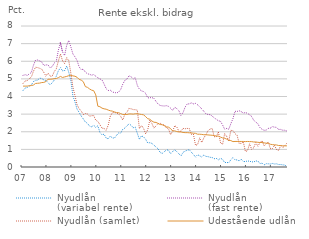
| Category | Nyudlån 
(variabel rente) | Nyudlån 
(fast rente) | Nyudlån (samlet) | Udestående udlån |
|---|---|---|---|---|
| 07 | 4.34 | 5.2 | 4.74 | 4.59 |
|  | 4.48 | 5.23 | 4.88 | 4.59 |
|  | 4.51 | 5.2 | 4.9 | 4.59 |
|  | 4.59 | 5.28 | 5.01 | 4.61 |
|  | 4.66 | 5.36 | 5.1 | 4.62 |
|  | 4.84 | 5.77 | 5.43 | 4.65 |
|  | 4.92 | 6.06 | 5.66 | 4.74 |
|  | 4.93 | 6.07 | 5.64 | 4.75 |
|  | 5.04 | 6.02 | 5.6 | 4.76 |
|  | 5.02 | 5.96 | 5.55 | 4.79 |
|  | 4.94 | 5.76 | 5.37 | 4.8 |
|  | 4.91 | 5.79 | 5.16 | 4.85 |
| 08 | 4.79 | 5.8 | 5.33 | 4.98 |
|  | 4.67 | 5.63 | 5.16 | 4.98 |
|  | 4.77 | 5.69 | 5.14 | 4.99 |
|  | 4.93 | 5.9 | 5.41 | 5.01 |
|  | 5.15 | 6 | 5.57 | 5.02 |
|  | 5.46 | 6.63 | 6.01 | 5.07 |
|  | 5.63 | 7.04 | 6.42 | 5.14 |
|  | 5.46 | 6.53 | 6.03 | 5.08 |
|  | 5.47 | 6.33 | 5.87 | 5.11 |
|  | 5.73 | 6.9 | 6.2 | 5.14 |
|  | 5.38 | 7.18 | 6.03 | 5.18 |
|  | 4.91 | 6.82 | 5.33 | 5.2 |
| 09 | 4.03 | 6.41 | 4.53 | 5.17 |
|  | 3.69 | 6.25 | 4.05 | 5.15 |
|  | 3.28 | 6.04 | 3.53 | 5.09 |
|  | 3.1 | 5.68 | 3.31 | 4.97 |
|  | 2.89 | 5.52 | 3.17 | 4.93 |
|  | 2.73 | 5.55 | 2.98 | 4.84 |
|  | 2.55 | 5.38 | 3.03 | 4.56 |
|  | 2.48 | 5.29 | 3.01 | 4.52 |
|  | 2.32 | 5.26 | 2.88 | 4.43 |
|  | 2.28 | 5.21 | 2.91 | 4.36 |
|  | 2.37 | 5.24 | 2.92 | 4.33 |
|  | 2.26 | 5.15 | 2.65 | 4.09 |
| 10 | 2.34 | 5.06 | 2.59 | 3.45 |
|  | 1.96 | 5 | 2.4 | 3.42 |
|  | 1.83 | 4.94 | 2.2 | 3.34 |
|  | 1.86 | 4.71 | 2.19 | 3.3 |
|  | 1.64 | 4.44 | 2.09 | 3.28 |
|  | 1.6 | 4.34 | 2.37 | 3.23 |
|  | 1.75 | 4.36 | 2.89 | 3.19 |
|  | 1.65 | 4.25 | 3.08 | 3.17 |
|  | 1.64 | 4.23 | 3.11 | 3.12 |
|  | 1.8 | 4.2 | 3.05 | 3.09 |
|  | 1.93 | 4.25 | 3.01 | 3.08 |
|  | 1.93 | 4.4 | 2.87 | 3.03 |
| 11 | 2.14 | 4.7 | 2.66 | 2.98 |
|  | 2.21 | 4.92 | 3.01 | 2.98 |
|  | 2.34 | 4.99 | 3.11 | 2.98 |
|  | 2.44 | 5.18 | 3.32 | 3.01 |
|  | 2.37 | 5.12 | 3.3 | 3.01 |
|  | 2.23 | 5.01 | 3.26 | 3 |
|  | 2.25 | 5.07 | 3.25 | 3.02 |
|  | 1.91 | 4.63 | 3.22 | 3.02 |
|  | 1.57 | 4.41 | 2.17 | 3 |
|  | 1.77 | 4.32 | 2.36 | 2.98 |
|  | 1.71 | 4.28 | 2.19 | 2.96 |
|  | 1.57 | 4.18 | 1.89 | 2.86 |
| 12 | 1.36 | 3.92 | 2.11 | 2.74 |
|  | 1.38 | 3.93 | 2.66 | 2.71 |
|  | 1.34 | 3.94 | 2.47 | 2.61 |
|  | 1.24 | 3.89 | 2.2 | 2.54 |
|  | 1.13 | 3.72 | 2.34 | 2.53 |
|  | 1.03 | 3.57 | 2.46 | 2.47 |
|  | 0.82 | 3.49 | 2.49 | 2.41 |
|  | 0.77 | 3.47 | 2.38 | 2.4 |
|  | 0.87 | 3.46 | 2.4 | 2.34 |
|  | 0.97 | 3.48 | 2.22 | 2.28 |
|  | 0.96 | 3.44 | 2.17 | 2.26 |
|  | 0.75 | 3.34 | 1.83 | 2.18 |
| 13 | 0.88 | 3.21 | 2.04 | 2.04 |
|  | 0.98 | 3.4 | 2.34 | 2.05 |
|  | 0.87 | 3.31 | 2.27 | 2.01 |
|  | 0.75 | 3.19 | 2.02 | 1.99 |
|  | 0.63 | 2.93 | 2.03 | 1.99 |
|  | 0.83 | 3.09 | 2.19 | 1.96 |
|  | 0.9 | 3.4 | 2.17 | 1.95 |
|  | 0.95 | 3.58 | 2.19 | 1.95 |
|  | 0.98 | 3.58 | 2.17 | 1.94 |
|  | 0.84 | 3.64 | 1.86 | 1.93 |
|  | 0.71 | 3.58 | 1.85 | 1.92 |
|  | 0.57 | 3.61 | 1.23 | 1.91 |
| 14 | 0.7 | 3.53 | 1.27 | 1.86 |
|  | 0.63 | 3.41 | 1.65 | 1.86 |
|  | 0.58 | 3.3 | 1.39 | 1.85 |
|  | 0.68 | 3.16 | 1.65 | 1.83 |
|  | 0.6 | 3.02 | 1.83 | 1.83 |
|  | 0.59 | 2.98 | 2.06 | 1.82 |
|  | 0.55 | 2.97 | 2.15 | 1.81 |
|  | 0.54 | 2.9 | 2.19 | 1.8 |
|  | 0.47 | 2.78 | 1.72 | 1.78 |
|  | 0.49 | 2.71 | 1.71 | 1.76 |
|  | 0.41 | 2.62 | 2 | 1.75 |
|  | 0.49 | 2.6 | 1.39 | 1.7 |
| 15 | 0.44 | 2.39 | 1.27 | 1.65 |
|  | 0.25 | 2.15 | 1.89 | 1.63 |
|  | 0.26 | 2.19 | 1.74 | 1.58 |
|  | 0.24 | 2.14 | 1.47 | 1.51 |
|  | 0.41 | 2.46 | 2.08 | 1.5 |
|  | 0.53 | 2.74 | 2.06 | 1.44 |
|  | 0.41 | 3.16 | 1.89 | 1.45 |
|  | 0.4 | 3.15 | 1.8 | 1.45 |
|  | 0.35 | 3.19 | 1.34 | 1.45 |
|  | 0.44 | 3.14 | 1.34 | 1.45 |
|  | 0.31 | 3.06 | 1.43 | 1.45 |
|  | 0.31 | 3.09 | 0.88 | 1.44 |
| 16 | 0.34 | 3.05 | 0.92 | 1.45 |
|  | 0.33 | 2.96 | 1.31 | 1.44 |
|  | 0.29 | 2.87 | 1.01 | 1.44 |
|  | 0.29 | 2.65 | 1.09 | 1.42 |
|  | 0.34 | 2.55 | 1.39 | 1.42 |
|  | 0.34 | 2.45 | 1.18 | 1.4 |
|  | 0.19 | 2.24 | 1.37 | 1.39 |
|  | 0.22 | 2.14 | 1.5 | 1.39 |
|  | 0.12 | 2.08 | 1.2 | 1.37 |
|  | 0.18 | 2.09 | 1.3 | 1.35 |
|  | 0.18 | 2.19 | 1.43 | 1.35 |
|  | 0.17 | 2.21 | 1.04 | 1.29 |
| 17 | 0.2 | 2.29 | 1.05 | 1.27 |